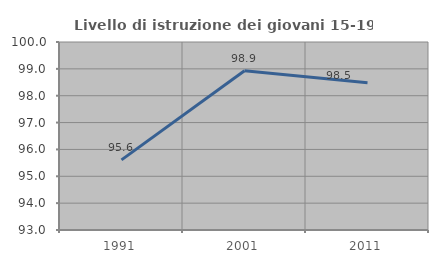
| Category | Livello di istruzione dei giovani 15-19 anni |
|---|---|
| 1991.0 | 95.61 |
| 2001.0 | 98.93 |
| 2011.0 | 98.485 |